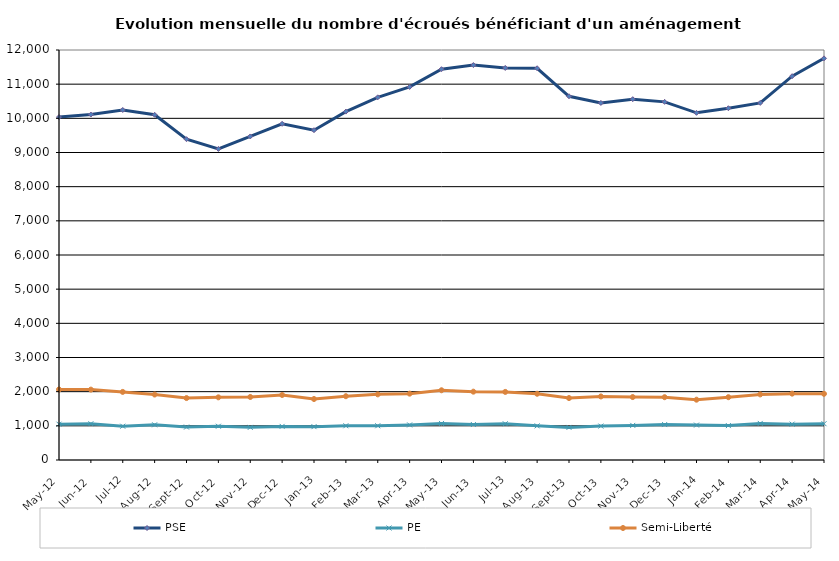
| Category | PSE | PE | Semi-Liberté |
|---|---|---|---|
| 2012-05-01 | 10036 | 1048 | 2064 |
| 2012-06-01 | 10111 | 1061 | 2060 |
| 2012-07-01 | 10244 | 989 | 1993 |
| 2012-08-01 | 10104 | 1030 | 1916 |
| 2012-09-01 | 9390 | 964 | 1813 |
| 2012-10-01 | 9105 | 988 | 1834 |
| 2012-11-01 | 9470 | 955 | 1845 |
| 2012-12-01 | 9840 | 984 | 1903 |
| 2013-01-01 | 9653 | 976 | 1785 |
| 2013-02-01 | 10197 | 1002 | 1867 |
| 2013-03-01 | 10615 | 1002 | 1921 |
| 2013-04-01 | 10919 | 1027 | 1942 |
| 2013-05-01 | 11438 | 1070 | 2041 |
| 2013-06-01 | 11559 | 1038 | 2000 |
| 2013-07-01 | 11475 | 1061 | 1993 |
| 2013-08-01 | 11465 | 999 | 1939 |
| 2013-09-01 | 10646 | 954 | 1813 |
| 2013-10-01 | 10451 | 993 | 1860 |
| 2013-11-01 | 10560 | 1013 | 1842 |
| 2013-12-01 | 10482 | 1037 | 1838 |
| 2014-01-01 | 10161 | 1022 | 1765 |
| 2014-02-01 | 10296 | 1007 | 1838 |
| 2014-03-01 | 10452 | 1071 | 1920 |
| 2014-04-01 | 11234 | 1050 | 1942 |
| 2014-05-01 | 11755 | 1062 | 1937 |